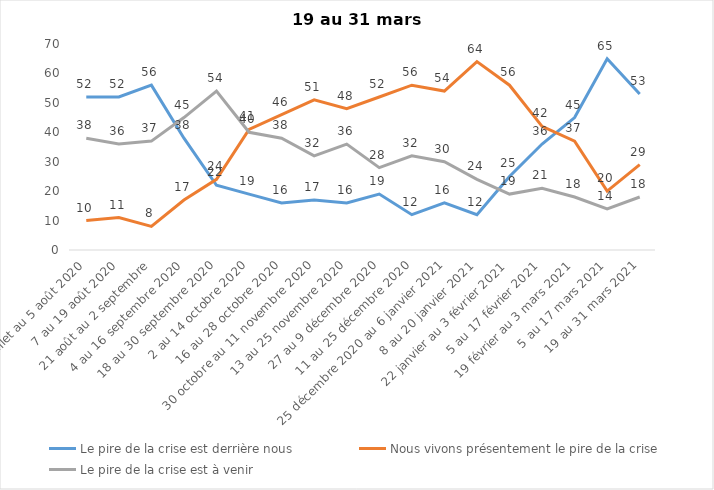
| Category | Le pire de la crise est derrière nous | Nous vivons présentement le pire de la crise | Le pire de la crise est à venir |
|---|---|---|---|
| 24 juillet au 5 août 2020 | 52 | 10 | 38 |
| 7 au 19 août 2020 | 52 | 11 | 36 |
| 21 août au 2 septembre | 56 | 8 | 37 |
| 4 au 16 septembre 2020 | 38 | 17 | 45 |
| 18 au 30 septembre 2020 | 22 | 24 | 54 |
| 2 au 14 octobre 2020 | 19 | 41 | 40 |
| 16 au 28 octobre 2020 | 16 | 46 | 38 |
| 30 octobre au 11 novembre 2020 | 17 | 51 | 32 |
| 13 au 25 novembre 2020 | 16 | 48 | 36 |
| 27 au 9 décembre 2020 | 19 | 52 | 28 |
| 11 au 25 décembre 2020 | 12 | 56 | 32 |
| 25 décembre 2020 au 6 janvier 2021 | 16 | 54 | 30 |
| 8 au 20 janvier 2021 | 12 | 64 | 24 |
| 22 janvier au 3 février 2021 | 25 | 56 | 19 |
| 5 au 17 février 2021 | 36 | 42 | 21 |
| 19 février au 3 mars 2021 | 45 | 37 | 18 |
| 5 au 17 mars 2021 | 65 | 20 | 14 |
| 19 au 31 mars 2021 | 53 | 29 | 18 |